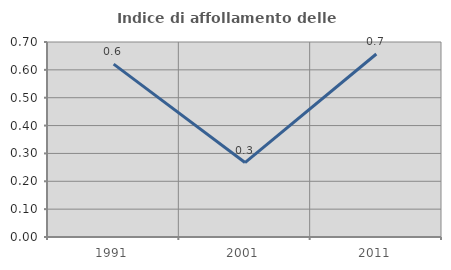
| Category | Indice di affollamento delle abitazioni  |
|---|---|
| 1991.0 | 0.621 |
| 2001.0 | 0.267 |
| 2011.0 | 0.657 |